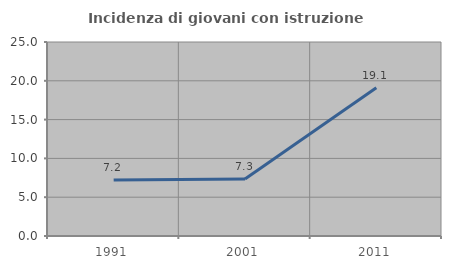
| Category | Incidenza di giovani con istruzione universitaria |
|---|---|
| 1991.0 | 7.207 |
| 2001.0 | 7.339 |
| 2011.0 | 19.118 |